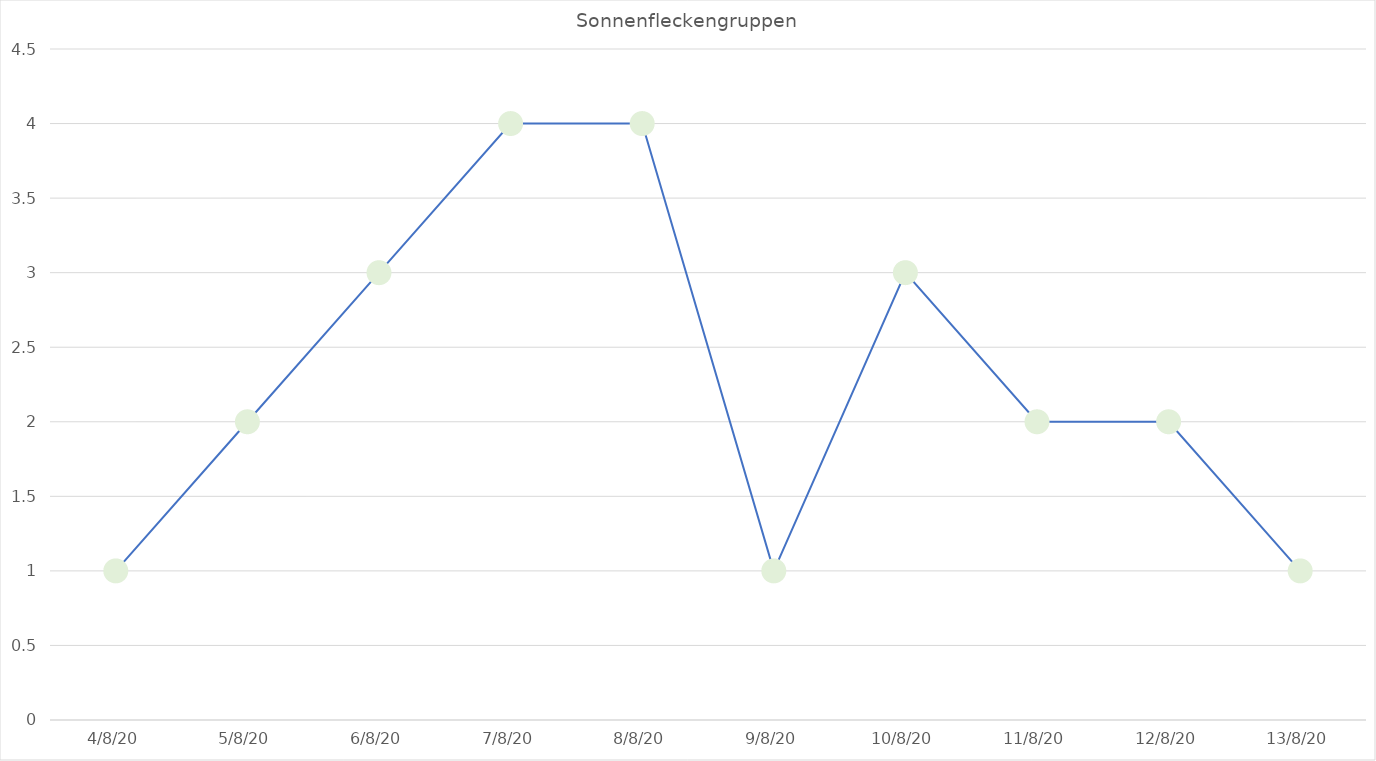
| Category | Flrcken |
|---|---|
| 2020-08-04 | 1 |
| 2020-08-05 | 2 |
| 2020-08-06 | 3 |
| 2020-08-07 | 4 |
| 2020-08-08 | 4 |
| 2020-08-09 | 1 |
| 2020-08-10 | 3 |
| 2020-08-11 | 2 |
| 2020-08-12 | 2 |
| 2020-08-13 | 1 |